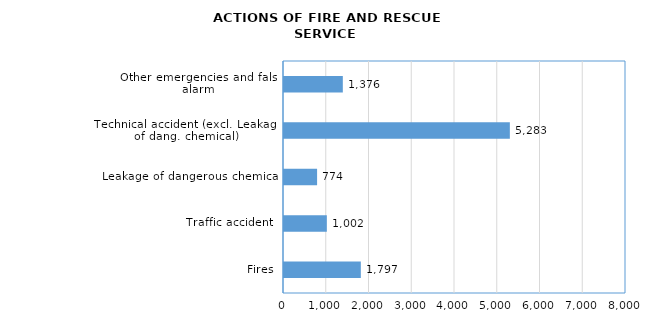
| Category | Series 0 |
|---|---|
| Fires | 1797 |
| Traffic accident
 | 1002 |
| Leakage of dangerous chemical
 | 774 |
| Technical accident (excl. Leakage of dang. chemical)
 | 5283 |
| Other emergencies and false alarm
 | 1376 |